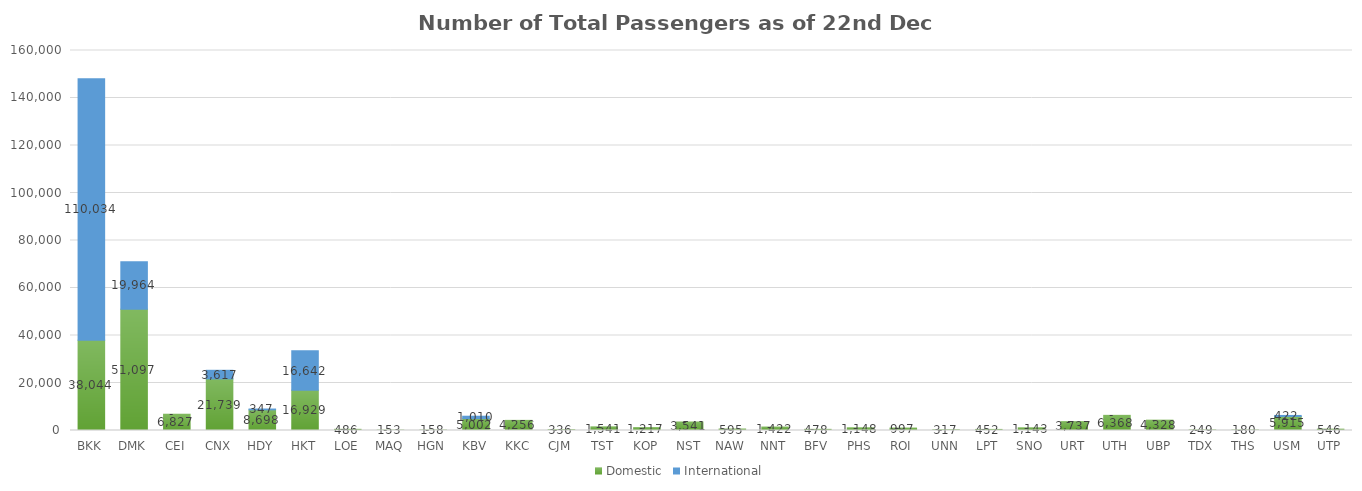
| Category | Domestic | International |
|---|---|---|
| BKK | 38044 | 110034 |
| DMK | 51097 | 19964 |
| CEI | 6827 | 0 |
| CNX | 21739 | 3617 |
| HDY | 8698 | 347 |
| HKT | 16929 | 16642 |
| LOE | 486 | 0 |
| MAQ | 153 | 0 |
| HGN | 158 | 0 |
| KBV | 5002 | 1010 |
| KKC | 4256 | 0 |
| CJM | 336 | 0 |
| TST | 1541 | 0 |
| KOP | 1217 | 0 |
| NST | 3541 | 0 |
| NAW | 595 | 0 |
| NNT | 1422 | 0 |
| BFV | 478 | 0 |
| PHS | 1148 | 0 |
| ROI | 997 | 0 |
| UNN | 317 | 0 |
| LPT | 452 | 0 |
| SNO | 1143 | 0 |
| URT | 3737 | 0 |
| UTH | 6368 | 0 |
| UBP | 4328 | 0 |
| TDX | 249 | 0 |
| THS | 180 | 0 |
| USM | 5915 | 422 |
| UTP | 546 | 0 |